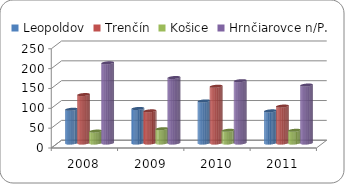
| Category | Leopoldov | Trenčín | Košice | Hrnčiarovce n/P. |
|---|---|---|---|---|
| 2008.0 | 85 | 122 | 30 | 202 |
| 2009.0 | 87 | 81 | 36 | 165 |
| 2010.0 | 106 | 143 | 32 | 157 |
| 2011.0 | 81 | 93 | 32 | 146 |